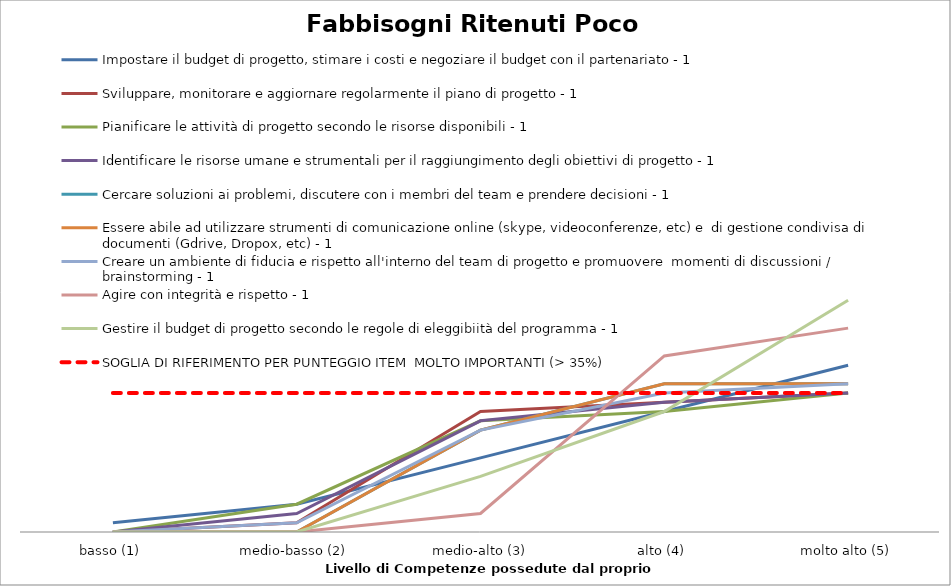
| Category | Impostare il budget di progetto, stimare i costi e negoziare il budget con il partenariato - 1 | Sviluppare, monitorare e aggiornare regolarmente il piano di progetto - 1 | Pianificare le attività di progetto secondo le risorse disponibili - 1 | Identificare le risorse umane e strumentali per il raggiungimento degli obiettivi di progetto - 1 | Cercare soluzioni ai problemi, discutere con i membri del team e prendere decisioni - 1 | Essere abile ad utilizzare strumenti di comunicazione online (skype, videoconferenze, etc) e  di gestione condivisa di documenti (Gdrive, Dropox, etc) - 1 | Creare un ambiente di fiducia e rispetto all'interno del team di progetto e promuovere  momenti di discussioni / brainstorming - 1 | Agire con integrità e rispetto - 1 | Gestire il budget di progetto secondo le regole di eleggibiità del programma - 1 | SOGLIA DI RIFERIMENTO PER PUNTEGGIO ITEM  MOLTO IMPORTANTI (> 35%) |
|---|---|---|---|---|---|---|---|---|---|---|
| basso (1) | 1 | 0 | 0 | 0 | 0 | 0 | 0 | 0 | 0 | 15 |
| medio-basso (2) | 3 | 1 | 3 | 2 | 0 | 0 | 1 | 0 | 0 | 15 |
|  medio-alto (3) | 8 | 13 | 12 | 12 | 11 | 11 | 11 | 2 | 6 | 15 |
| alto (4) | 13 | 14 | 13 | 14 | 16 | 16 | 15 | 19 | 13 | 15 |
| molto alto (5) | 18 | 15 | 15 | 15 | 16 | 16 | 16 | 22 | 25 | 15 |